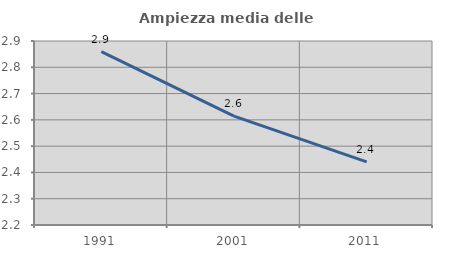
| Category | Ampiezza media delle famiglie |
|---|---|
| 1991.0 | 2.859 |
| 2001.0 | 2.614 |
| 2011.0 | 2.44 |